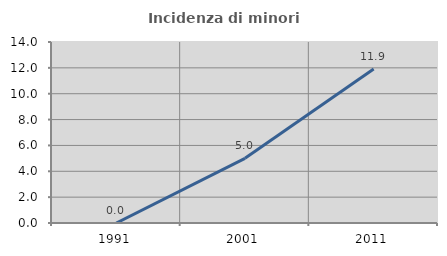
| Category | Incidenza di minori stranieri |
|---|---|
| 1991.0 | 0 |
| 2001.0 | 5 |
| 2011.0 | 11.905 |